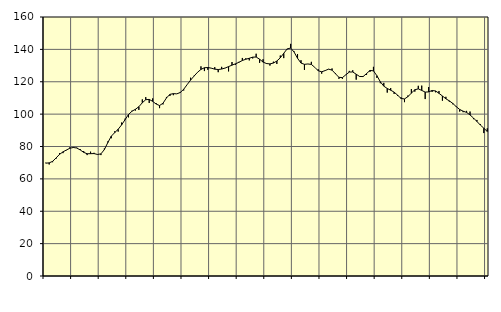
| Category | Piggar | Series 1 |
|---|---|---|
| nan | 70 | 69.7 |
| 87.0 | 68.9 | 69.88 |
| 87.0 | 70.3 | 70.83 |
| 87.0 | 72.5 | 72.91 |
| nan | 75.9 | 75.14 |
| 88.0 | 75.9 | 76.68 |
| 88.0 | 77.7 | 77.84 |
| 88.0 | 79.5 | 78.91 |
| nan | 79.7 | 79.4 |
| 89.0 | 79.3 | 79.06 |
| 89.0 | 78.4 | 77.86 |
| 89.0 | 77.2 | 76.39 |
| nan | 74.7 | 75.53 |
| 90.0 | 76.8 | 75.56 |
| 90.0 | 76.1 | 75.63 |
| 90.0 | 75.2 | 75.07 |
| nan | 74.7 | 75.44 |
| 91.0 | 78.8 | 78.09 |
| 91.0 | 83.1 | 82.44 |
| 91.0 | 85.1 | 86.37 |
| nan | 89.4 | 88.59 |
| 92.0 | 89.2 | 90.64 |
| 92.0 | 94.8 | 93.35 |
| 92.0 | 97.2 | 96.59 |
| nan | 98 | 99.78 |
| 93.0 | 102.1 | 101.79 |
| 93.0 | 102.2 | 102.98 |
| 93.0 | 102.6 | 104.58 |
| nan | 109.1 | 107.02 |
| 94.0 | 110.5 | 108.91 |
| 94.0 | 106.9 | 109.1 |
| 94.0 | 109.7 | 107.88 |
| nan | 106.8 | 106.23 |
| 95.0 | 103.7 | 105.3 |
| 95.0 | 106 | 106.74 |
| 95.0 | 110.6 | 109.98 |
| nan | 111.2 | 112.22 |
| 96.0 | 111.7 | 112.66 |
| 96.0 | 112.5 | 112.52 |
| 96.0 | 113.7 | 113.34 |
| nan | 114.6 | 115.37 |
| 97.0 | 118.2 | 118.25 |
| 97.0 | 122.5 | 121.02 |
| 97.0 | 123.7 | 123.5 |
| nan | 125.7 | 125.83 |
| 98.0 | 129.5 | 127.63 |
| 98.0 | 126.6 | 128.64 |
| 98.0 | 127.4 | 128.81 |
| nan | 128.3 | 128.39 |
| 99.0 | 129 | 127.77 |
| 99.0 | 125.9 | 127.55 |
| 99.0 | 129.2 | 127.85 |
| nan | 128.4 | 128.47 |
| 0.0 | 126.4 | 129.35 |
| 0.0 | 132.2 | 130.27 |
| 0.0 | 130.4 | 131.07 |
| nan | 132.3 | 132 |
| 1.0 | 134.7 | 133.13 |
| 1.0 | 134.5 | 133.89 |
| 1.0 | 133.2 | 134.5 |
| nan | 134.4 | 135.2 |
| 2.0 | 137.3 | 135.27 |
| 2.0 | 131.7 | 133.92 |
| 2.0 | 133.9 | 132.14 |
| nan | 131 | 131.25 |
| 3.0 | 130 | 131.03 |
| 3.0 | 132.4 | 131.55 |
| 3.0 | 131 | 132.81 |
| nan | 136.2 | 134.78 |
| 4.0 | 134.6 | 137.57 |
| 4.0 | 140.1 | 140.3 |
| 4.0 | 143.4 | 140.82 |
| nan | 138.7 | 138.34 |
| 5.0 | 137.1 | 134.5 |
| 5.0 | 133.3 | 131.55 |
| 5.0 | 127.3 | 130.76 |
| nan | 131 | 130.98 |
| 6.0 | 132.3 | 130.7 |
| 6.0 | 128.9 | 128.91 |
| 6.0 | 127.7 | 126.77 |
| nan | 125 | 126.16 |
| 7.0 | 127 | 126.9 |
| 7.0 | 127.9 | 127.79 |
| 7.0 | 128.2 | 127.18 |
| nan | 125.3 | 124.92 |
| 8.0 | 121.8 | 122.73 |
| 8.0 | 121.8 | 122.56 |
| 8.0 | 124.4 | 124.29 |
| nan | 126.7 | 125.99 |
| 9.0 | 127.1 | 126.05 |
| 9.0 | 121.3 | 124.65 |
| 9.0 | 123.4 | 123.26 |
| nan | 123.4 | 123.2 |
| 10.0 | 124.2 | 125.03 |
| 10.0 | 126.1 | 127 |
| 10.0 | 129.2 | 126.73 |
| nan | 122.4 | 123.74 |
| 11.0 | 119.1 | 119.98 |
| 11.0 | 119.3 | 117.27 |
| 11.0 | 113.3 | 115.84 |
| nan | 116.1 | 114.78 |
| 12.0 | 112.5 | 113.58 |
| 12.0 | 111.2 | 111.73 |
| 12.0 | 110.4 | 109.67 |
| nan | 107.4 | 109.39 |
| 13.0 | 111.5 | 110.8 |
| 13.0 | 115.5 | 113 |
| 13.0 | 113.9 | 115.06 |
| nan | 117.5 | 115.59 |
| 14.0 | 117.6 | 114.66 |
| 14.0 | 109.3 | 113.61 |
| 14.0 | 116.7 | 113.73 |
| nan | 113.7 | 114.59 |
| 15.0 | 113.5 | 114.32 |
| 15.0 | 114.3 | 112.85 |
| 15.0 | 108.3 | 111.2 |
| nan | 110.7 | 109.46 |
| 16.0 | 107.7 | 108.2 |
| 16.0 | 106.1 | 106.62 |
| 16.0 | 104.9 | 104.62 |
| nan | 101.6 | 102.88 |
| 17.0 | 101.2 | 101.81 |
| 17.0 | 102 | 101.08 |
| 17.0 | 101.6 | 99.49 |
| nan | 96.9 | 97.61 |
| 18.0 | 96.4 | 95.45 |
| 18.0 | 93.9 | 93.24 |
| 18.0 | 88.3 | 91.31 |
| nan | 91.2 | 89.26 |